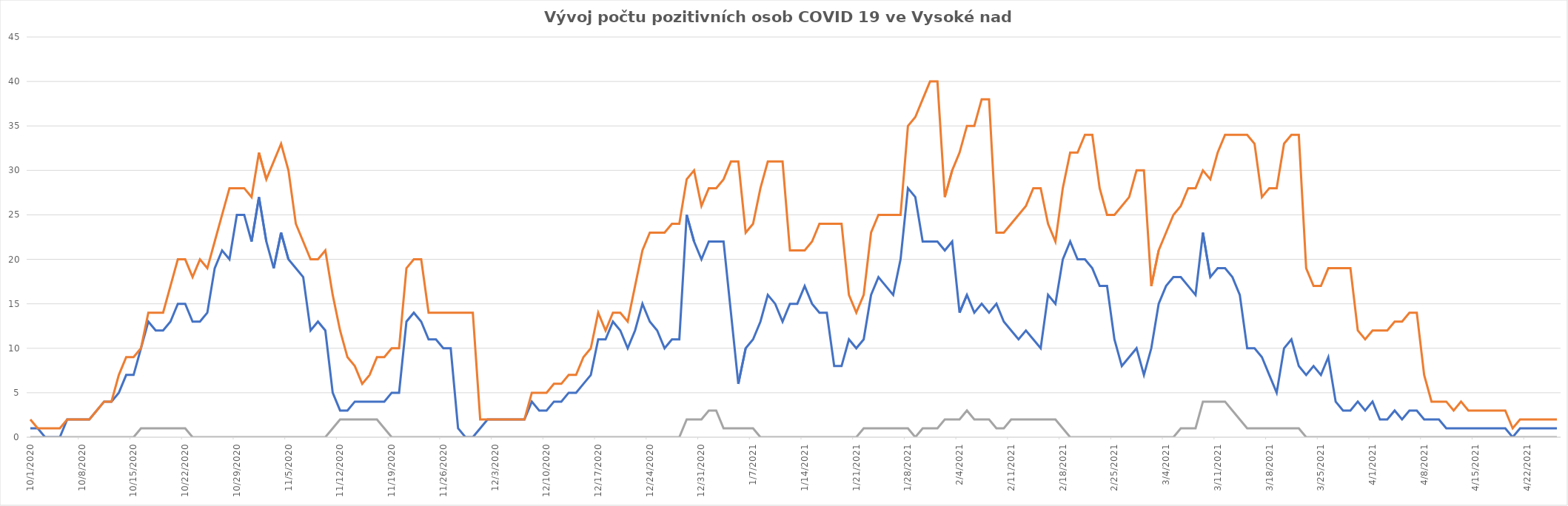
| Category | Series 0 | Series 1 | Series 2 |
|---|---|---|---|
| 10/1/20 | 1 | 2 | 0 |
| 10/2/20 | 1 | 1 | 0 |
| 10/3/20 | 0 | 1 | 0 |
| 10/4/20 | 0 | 1 | 0 |
| 10/5/20 | 0 | 1 | 0 |
| 10/6/20 | 2 | 2 | 0 |
| 10/7/20 | 2 | 2 | 0 |
| 10/8/20 | 2 | 2 | 0 |
| 10/9/20 | 2 | 2 | 0 |
| 10/10/20 | 3 | 3 | 0 |
| 10/11/20 | 4 | 4 | 0 |
| 10/12/20 | 4 | 4 | 0 |
| 10/13/20 | 5 | 7 | 0 |
| 10/14/20 | 7 | 9 | 0 |
| 10/15/20 | 7 | 9 | 0 |
| 10/16/20 | 10 | 10 | 1 |
| 10/17/20 | 13 | 14 | 1 |
| 10/18/20 | 12 | 14 | 1 |
| 10/19/20 | 12 | 14 | 1 |
| 10/20/20 | 13 | 17 | 1 |
| 10/21/20 | 15 | 20 | 1 |
| 10/22/20 | 15 | 20 | 1 |
| 10/23/20 | 13 | 18 | 0 |
| 10/24/20 | 13 | 20 | 0 |
| 10/25/20 | 14 | 19 | 0 |
| 10/26/20 | 19 | 22 | 0 |
| 10/27/20 | 21 | 25 | 0 |
| 10/28/20 | 20 | 28 | 0 |
| 10/29/20 | 25 | 28 | 0 |
| 10/30/20 | 25 | 28 | 0 |
| 10/31/20 | 22 | 27 | 0 |
| 11/1/20 | 27 | 32 | 0 |
| 11/2/20 | 22 | 29 | 0 |
| 11/3/20 | 19 | 31 | 0 |
| 11/4/20 | 23 | 33 | 0 |
| 11/5/20 | 20 | 30 | 0 |
| 11/6/20 | 19 | 24 | 0 |
| 11/7/20 | 18 | 22 | 0 |
| 11/8/20 | 12 | 20 | 0 |
| 11/9/20 | 13 | 20 | 0 |
| 11/10/20 | 12 | 21 | 0 |
| 11/11/20 | 5 | 16 | 1 |
| 11/12/20 | 3 | 12 | 2 |
| 11/13/20 | 3 | 9 | 2 |
| 11/14/20 | 4 | 8 | 2 |
| 11/15/20 | 4 | 6 | 2 |
| 11/16/20 | 4 | 7 | 2 |
| 11/17/20 | 4 | 9 | 2 |
| 11/18/20 | 4 | 9 | 1 |
| 11/19/20 | 5 | 10 | 0 |
| 11/20/20 | 5 | 10 | 0 |
| 11/21/20 | 13 | 19 | 0 |
| 11/22/20 | 14 | 20 | 0 |
| 11/23/20 | 13 | 20 | 0 |
| 11/24/20 | 11 | 14 | 0 |
| 11/25/20 | 11 | 14 | 0 |
| 11/26/20 | 10 | 14 | 0 |
| 11/27/20 | 10 | 14 | 0 |
| 11/28/20 | 1 | 14 | 0 |
| 11/29/20 | 0 | 14 | 0 |
| 11/30/20 | 0 | 14 | 0 |
| 12/1/20 | 1 | 2 | 0 |
| 12/2/20 | 2 | 2 | 0 |
| 12/3/20 | 2 | 2 | 0 |
| 12/4/20 | 2 | 2 | 0 |
| 12/5/20 | 2 | 2 | 0 |
| 12/6/20 | 2 | 2 | 0 |
| 12/7/20 | 2 | 2 | 0 |
| 12/8/20 | 4 | 5 | 0 |
| 12/9/20 | 3 | 5 | 0 |
| 12/10/20 | 3 | 5 | 0 |
| 12/11/20 | 4 | 6 | 0 |
| 12/12/20 | 4 | 6 | 0 |
| 12/13/20 | 5 | 7 | 0 |
| 12/14/20 | 5 | 7 | 0 |
| 12/15/20 | 6 | 9 | 0 |
| 12/16/20 | 7 | 10 | 0 |
| 12/17/20 | 11 | 14 | 0 |
| 12/18/20 | 11 | 12 | 0 |
| 12/19/20 | 13 | 14 | 0 |
| 12/20/20 | 12 | 14 | 0 |
| 12/21/20 | 10 | 13 | 0 |
| 12/22/20 | 12 | 17 | 0 |
| 12/23/20 | 15 | 21 | 0 |
| 12/24/20 | 13 | 23 | 0 |
| 12/25/20 | 12 | 23 | 0 |
| 12/26/20 | 10 | 23 | 0 |
| 12/27/20 | 11 | 24 | 0 |
| 12/28/20 | 11 | 24 | 0 |
| 12/29/20 | 25 | 29 | 2 |
| 12/30/20 | 22 | 30 | 2 |
| 12/31/20 | 20 | 26 | 2 |
| 1/1/21 | 22 | 28 | 3 |
| 1/2/21 | 22 | 28 | 3 |
| 1/3/21 | 22 | 29 | 1 |
| 1/4/21 | 14 | 31 | 1 |
| 1/5/21 | 6 | 31 | 1 |
| 1/6/21 | 10 | 23 | 1 |
| 1/7/21 | 11 | 24 | 1 |
| 1/8/21 | 13 | 28 | 0 |
| 1/9/21 | 16 | 31 | 0 |
| 1/10/21 | 15 | 31 | 0 |
| 1/11/21 | 13 | 31 | 0 |
| 1/12/21 | 15 | 21 | 0 |
| 1/13/21 | 15 | 21 | 0 |
| 1/14/21 | 17 | 21 | 0 |
| 1/15/21 | 15 | 22 | 0 |
| 1/16/21 | 14 | 24 | 0 |
| 1/17/21 | 14 | 24 | 0 |
| 1/18/21 | 8 | 24 | 0 |
| 1/19/21 | 8 | 24 | 0 |
| 1/20/21 | 11 | 16 | 0 |
| 1/21/21 | 10 | 14 | 0 |
| 1/22/21 | 11 | 16 | 1 |
| 1/23/21 | 16 | 23 | 1 |
| 1/24/21 | 18 | 25 | 1 |
| 1/25/21 | 17 | 25 | 1 |
| 1/26/21 | 16 | 25 | 1 |
| 1/27/21 | 20 | 25 | 1 |
| 1/28/21 | 28 | 35 | 1 |
| 1/29/21 | 27 | 36 | 0 |
| 1/30/21 | 22 | 38 | 1 |
| 1/31/21 | 22 | 40 | 1 |
| 2/1/21 | 22 | 40 | 1 |
| 2/2/21 | 21 | 27 | 2 |
| 2/3/21 | 22 | 30 | 2 |
| 2/4/21 | 14 | 32 | 2 |
| 2/5/21 | 16 | 35 | 3 |
| 2/6/21 | 14 | 35 | 2 |
| 2/7/21 | 15 | 38 | 2 |
| 2/8/21 | 14 | 38 | 2 |
| 2/9/21 | 15 | 23 | 1 |
| 2/10/21 | 13 | 23 | 1 |
| 2/11/21 | 12 | 24 | 2 |
| 2/12/21 | 11 | 25 | 2 |
| 2/13/21 | 12 | 26 | 2 |
| 2/14/21 | 11 | 28 | 2 |
| 2/15/21 | 10 | 28 | 2 |
| 2/16/21 | 16 | 24 | 2 |
| 2/17/21 | 15 | 22 | 2 |
| 2/18/21 | 20 | 28 | 1 |
| 2/19/21 | 22 | 32 | 0 |
| 2/20/21 | 20 | 32 | 0 |
| 2/21/21 | 20 | 34 | 0 |
| 2/22/21 | 19 | 34 | 0 |
| 2/23/21 | 17 | 28 | 0 |
| 2/24/21 | 17 | 25 | 0 |
| 2/25/21 | 11 | 25 | 0 |
| 2/26/21 | 8 | 26 | 0 |
| 2/27/21 | 9 | 27 | 0 |
| 2/28/21 | 10 | 30 | 0 |
| 3/1/21 | 7 | 30 | 0 |
| 3/2/21 | 10 | 17 | 0 |
| 3/3/21 | 15 | 21 | 0 |
| 3/4/21 | 17 | 23 | 0 |
| 3/5/21 | 18 | 25 | 0 |
| 3/6/21 | 18 | 26 | 1 |
| 3/7/21 | 17 | 28 | 1 |
| 3/8/21 | 16 | 28 | 1 |
| 3/9/21 | 23 | 30 | 4 |
| 3/10/21 | 18 | 29 | 4 |
| 3/11/21 | 19 | 32 | 4 |
| 3/12/21 | 19 | 34 | 4 |
| 3/13/21 | 18 | 34 | 3 |
| 3/14/21 | 16 | 34 | 2 |
| 3/15/21 | 10 | 34 | 1 |
| 3/16/21 | 10 | 33 | 1 |
| 3/17/21 | 9 | 27 | 1 |
| 3/18/21 | 7 | 28 | 1 |
| 3/19/21 | 5 | 28 | 1 |
| 3/20/21 | 10 | 33 | 1 |
| 3/21/21 | 11 | 34 | 1 |
| 3/22/21 | 8 | 34 | 1 |
| 3/23/21 | 7 | 19 | 0 |
| 3/24/21 | 8 | 17 | 0 |
| 3/25/21 | 7 | 17 | 0 |
| 3/26/21 | 9 | 19 | 0 |
| 3/27/21 | 4 | 19 | 0 |
| 3/28/21 | 3 | 19 | 0 |
| 3/29/21 | 3 | 19 | 0 |
| 3/30/21 | 4 | 12 | 0 |
| 3/31/21 | 3 | 11 | 0 |
| 4/1/21 | 4 | 12 | 0 |
| 4/2/21 | 2 | 12 | 0 |
| 4/3/21 | 2 | 12 | 0 |
| 4/4/21 | 3 | 13 | 0 |
| 4/5/21 | 2 | 13 | 0 |
| 4/6/21 | 3 | 14 | 0 |
| 4/7/21 | 3 | 14 | 0 |
| 4/8/21 | 2 | 7 | 0 |
| 4/9/21 | 2 | 4 | 0 |
| 4/10/21 | 2 | 4 | 0 |
| 4/11/21 | 1 | 4 | 0 |
| 4/12/21 | 1 | 3 | 0 |
| 4/13/21 | 1 | 4 | 0 |
| 4/14/21 | 1 | 3 | 0 |
| 4/15/21 | 1 | 3 | 0 |
| 4/16/21 | 1 | 3 | 0 |
| 4/17/21 | 1 | 3 | 0 |
| 4/18/21 | 1 | 3 | 0 |
| 4/19/21 | 1 | 3 | 0 |
| 4/20/21 | 0 | 1 | 0 |
| 4/21/21 | 1 | 2 | 0 |
| 4/22/21 | 1 | 2 | 0 |
| 4/23/21 | 1 | 2 | 0 |
| 4/24/21 | 1 | 2 | 0 |
| 4/25/21 | 1 | 2 | 0 |
| 4/26/21 | 1 | 2 | 0 |